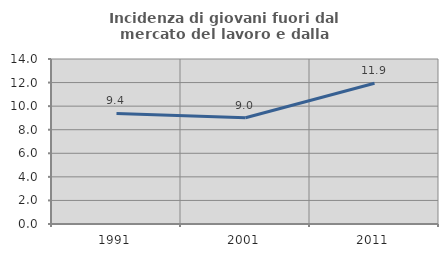
| Category | Incidenza di giovani fuori dal mercato del lavoro e dalla formazione  |
|---|---|
| 1991.0 | 9.383 |
| 2001.0 | 9.016 |
| 2011.0 | 11.944 |